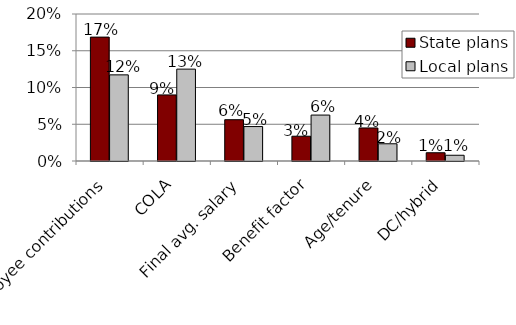
| Category | State plans | Local plans |
|---|---|---|
| Employee contributions | 0.169 | 0.117 |
| COLA | 0.09 | 0.125 |
| Final avg. salary | 0.056 | 0.047 |
| Benefit factor | 0.034 | 0.062 |
| Age/tenure | 0.045 | 0.023 |
| DC/hybrid | 0.011 | 0.008 |